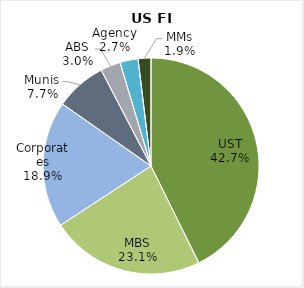
| Category | Fixed Income Outstanding Breakout |
|---|---|
| UST | 0.427 |
| MBS | 0.231 |
| Corporates | 0.189 |
| Munis | 0.077 |
| ABS | 0.03 |
| Agency | 0.027 |
| MMs | 0.019 |